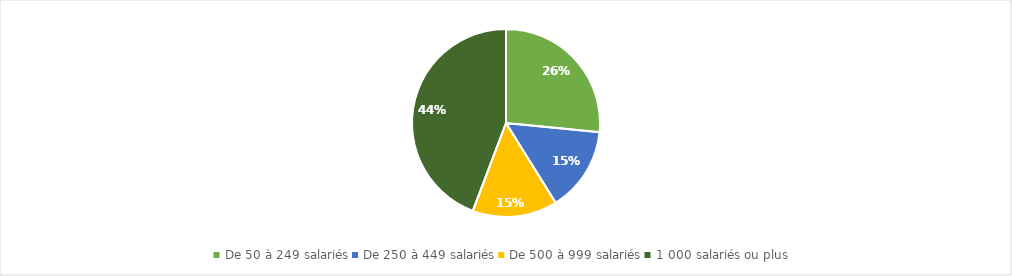
| Category | Part des ruptures envisagées* par taille d'entreprise (en %) |
|---|---|
| De 50 à 249 salariés | 0.265 |
| De 250 à 449 salariés | 0.145 |
| De 500 à 999 salariés | 0.146 |
| 1 000 salariés ou plus | 0.441 |